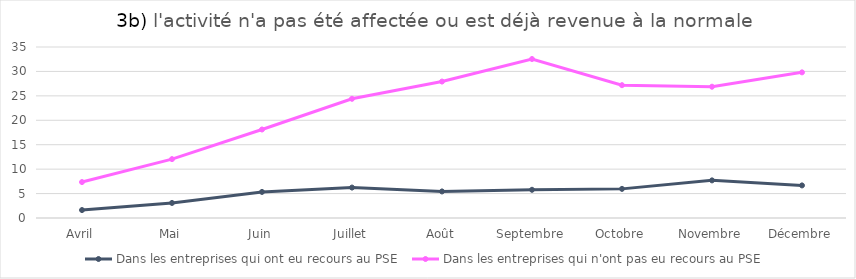
| Category | Dans les entreprises qui ont eu recours au PSE  | Dans les entreprises qui n'ont pas eu recours au PSE  |
|---|---|---|
| Avril | 1.625 | 7.355 |
| Mai | 3.081 | 12.054 |
| Juin | 5.336 | 18.114 |
| Juillet | 6.231 | 24.399 |
| Août | 5.436 | 27.927 |
| Septembre | 5.775 | 32.542 |
| Octobre | 5.961 | 27.184 |
| Novembre | 7.702 | 26.871 |
| Décembre | 6.67 | 29.811 |